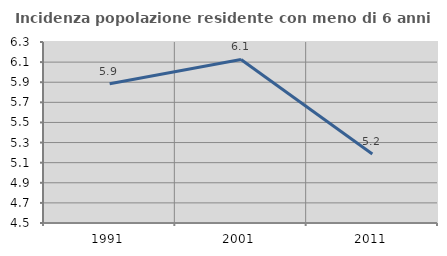
| Category | Incidenza popolazione residente con meno di 6 anni |
|---|---|
| 1991.0 | 5.885 |
| 2001.0 | 6.127 |
| 2011.0 | 5.186 |